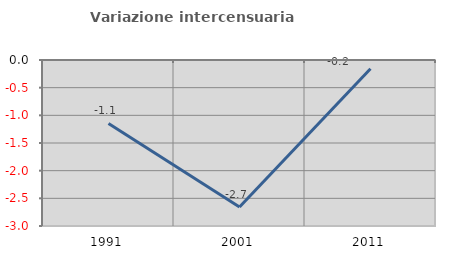
| Category | Variazione intercensuaria annua |
|---|---|
| 1991.0 | -1.147 |
| 2001.0 | -2.657 |
| 2011.0 | -0.157 |